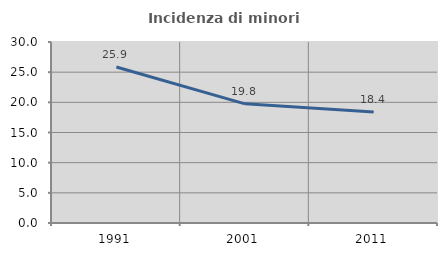
| Category | Incidenza di minori stranieri |
|---|---|
| 1991.0 | 25.862 |
| 2001.0 | 19.753 |
| 2011.0 | 18.391 |